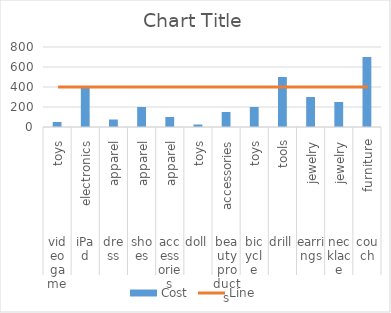
| Category | Cost |
|---|---|
| 0 | 50 |
| 1 | 400 |
| 2 | 75 |
| 3 | 200 |
| 4 | 100 |
| 5 | 25 |
| 6 | 150 |
| 7 | 200 |
| 8 | 500 |
| 9 | 300 |
| 10 | 250 |
| 11 | 700 |